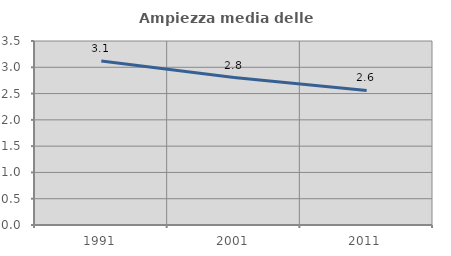
| Category | Ampiezza media delle famiglie |
|---|---|
| 1991.0 | 3.12 |
| 2001.0 | 2.805 |
| 2011.0 | 2.561 |